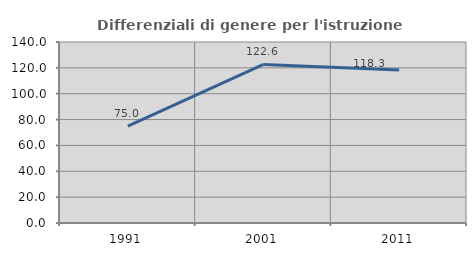
| Category | Differenziali di genere per l'istruzione superiore |
|---|---|
| 1991.0 | 74.963 |
| 2001.0 | 122.649 |
| 2011.0 | 118.289 |